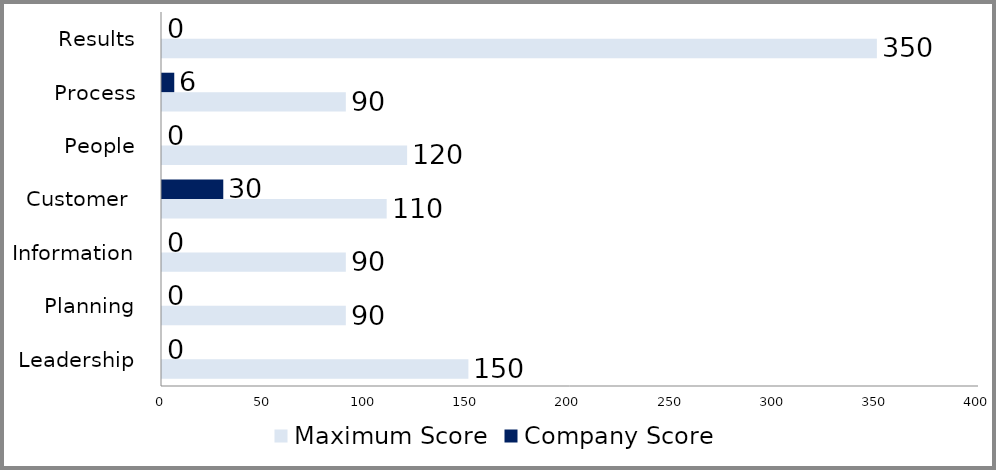
| Category | Maximum Score | Company Score |
|---|---|---|
| Leadership | 150 | 0 |
| Planning | 90 | 0 |
| Information | 90 | 0 |
| Customer  | 110 | 30 |
| People | 120 | 0 |
| Process | 90 | 6 |
| Results | 350 | 0 |